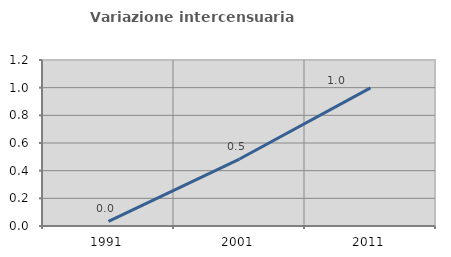
| Category | Variazione intercensuaria annua |
|---|---|
| 1991.0 | 0.033 |
| 2001.0 | 0.484 |
| 2011.0 | 0.998 |